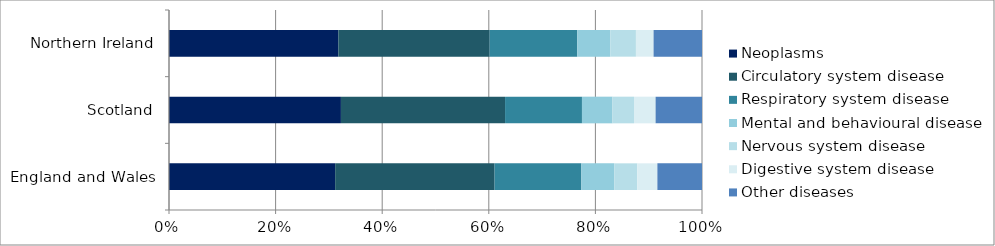
| Category | Neoplasms | Circulatory system disease | Respiratory system disease | Mental and behavioural disease | Nervous system disease | Digestive system disease | Other diseases |
|---|---|---|---|---|---|---|---|
| England and Wales | 61534 | 59041 | 32136 | 12177 | 8551 | 7427 | 16524 |
| Scotland | 6511 | 6216 | 2912 | 1156 | 814 | 819 | 1757 |
| Northern Ireland | 1756 | 1568 | 909 | 342 | 266 | 183 | 502 |